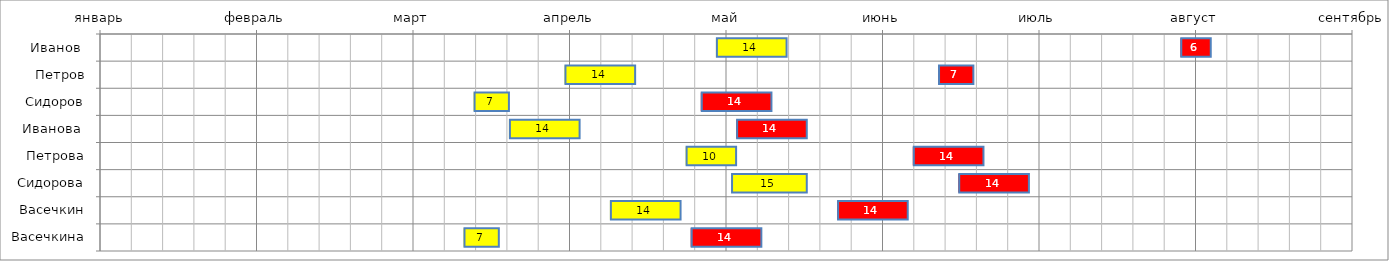
| Category | Столбец1 | Продолжи- тельность1, дней | Столбец2 | Продолжи- тельность2, дней |
|---|---|---|---|---|
| Иванов  | 123 | 14 | 78 | 6 |
| Петров | 93 | 14 | 60 | 7 |
| Сидоров | 75 | 7 | 38 | 14 |
| Иванова  | 82 | 14 | 31 | 14 |
| Петрова | 117 | 10 | 35 | 14 |
| Сидорова | 126 | 15 | 30 | 14 |
| Васечкин | 102 | 14 | 31 | 14 |
| Васечкина | 73 | 7 | 38 | 14 |